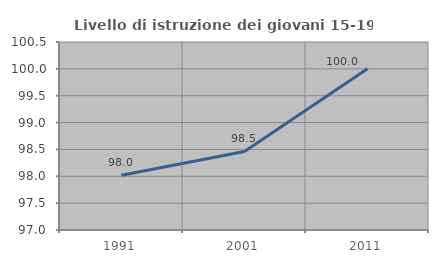
| Category | Livello di istruzione dei giovani 15-19 anni |
|---|---|
| 1991.0 | 98.02 |
| 2001.0 | 98.462 |
| 2011.0 | 100 |